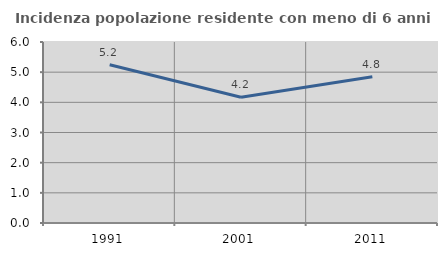
| Category | Incidenza popolazione residente con meno di 6 anni |
|---|---|
| 1991.0 | 5.247 |
| 2001.0 | 4.17 |
| 2011.0 | 4.846 |